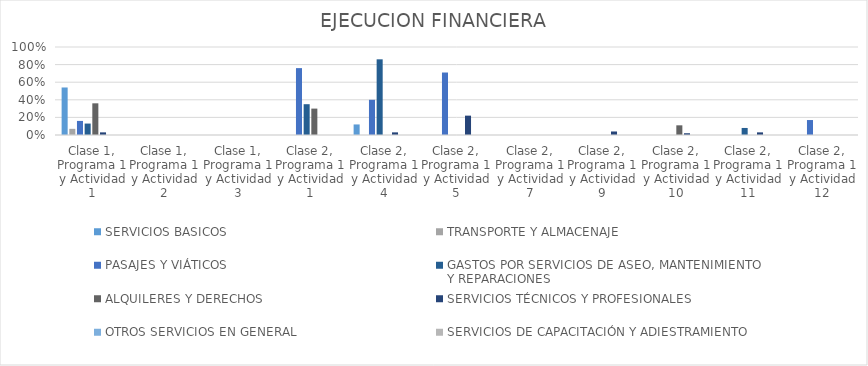
| Category | SERVICIOS BASICOS | TRANSPORTE Y ALMACENAJE | PASAJES Y VIÁTICOS | GASTOS POR SERVICIOS DE ASEO, MANTENIMIENTO
Y REPARACIONES | ALQUILERES Y DERECHOS | SERVICIOS TÉCNICOS Y PROFESIONALES | OTROS SERVICIOS EN GENERAL | SERVICIOS DE CAPACITACIÓN Y ADIESTRAMIENTO |
|---|---|---|---|---|---|---|---|---|
| Clase 1, Programa 1 y Actividad 1 | 0.54 | 0.07 | 0.16 | 0.13 | 0.36 | 0.03 | 0 | 0 |
| Clase 1, Programa 1 y Actividad 2 | 0 | 0 | 0 | 0 | 0 | 0 | 0 | 0 |
| Clase 1, Programa 1 y Actividad 3 | 0 | 0 | 0 | 0 | 0 | 0 | 0 | 0 |
| Clase 2, Programa 1 y Actividad 1 | 0 | 0 | 0.76 | 0.35 | 0.3 | 0 | 0 | 0 |
| Clase 2, Programa 1 y Actividad 4 | 0.12 | 0 | 0.4 | 0.86 | 0 | 0.03 | 0 | 0 |
| Clase 2, Programa 1 y Actividad 5 | 0 | 0 | 0.71 | 0 | 0 | 0.22 | 0 | 0 |
| Clase 2, Programa 1 y Actividad 7 | 0 | 0 | 0 | 0 | 0 | 0 | 0 | 0 |
| Clase 2, Programa 1 y Actividad 9 | 0 | 0 | 0 | 0 | 0 | 0.04 | 0 | 0 |
| Clase 2, Programa 1 y Actividad 10 | 0 | 0 | 0 | 0 | 0.11 | 0.02 | 0 | 0 |
| Clase 2, Programa 1 y Actividad 11 | 0 | 0 | 0 | 0.08 | 0 | 0.03 | 0 | 0 |
| Clase 2, Programa 1 y Actividad 12 | 0 | 0 | 0.17 | 0 | 0 | 0 | 0 | 0 |